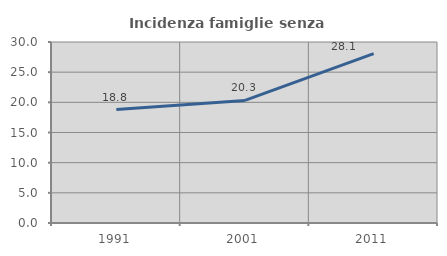
| Category | Incidenza famiglie senza nuclei |
|---|---|
| 1991.0 | 18.808 |
| 2001.0 | 20.311 |
| 2011.0 | 28.087 |